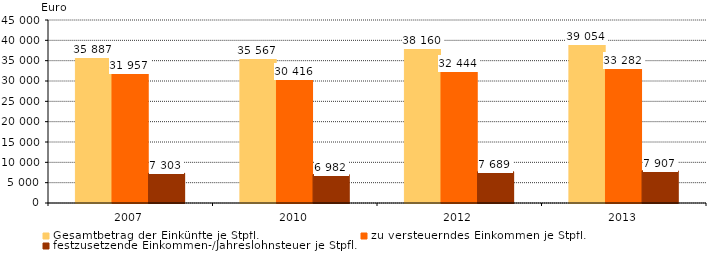
| Category | Gesamtbetrag der Einkünfte je Stpfl. | zu versteuerndes Einkommen je Stpfl. | festzusetzende Einkommen-/Jahreslohnsteuer je Stpfl. |
|---|---|---|---|
| 2007.0 | 35887 | 31957 | 7303 |
| 2010.0 | 35567 | 30416 | 6982 |
| 2012.0 | 38160 | 32444 | 7689 |
| 2013.0 | 39054 | 33282 | 7907 |